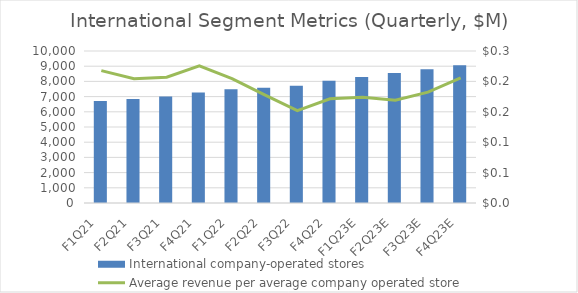
| Category | International company-operated stores |
|---|---|
|  F1Q21  | 6713 |
|  F2Q21  | 6836 |
|  F3Q21  | 7013 |
|  F4Q21  | 7272 |
|  F1Q22  | 7485 |
|  F2Q22  | 7587 |
|  F3Q22  | 7717 |
|  F4Q22  | 8037 |
|  F1Q23E  | 8292 |
|  F2Q23E  | 8547 |
|  F3Q23E  | 8802 |
|  F4Q23E  | 9059 |